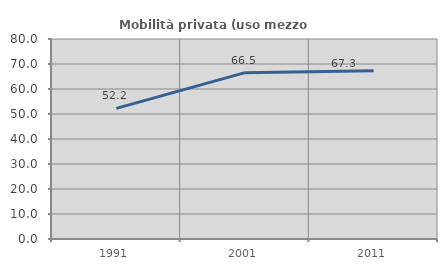
| Category | Mobilità privata (uso mezzo privato) |
|---|---|
| 1991.0 | 52.234 |
| 2001.0 | 66.541 |
| 2011.0 | 67.265 |